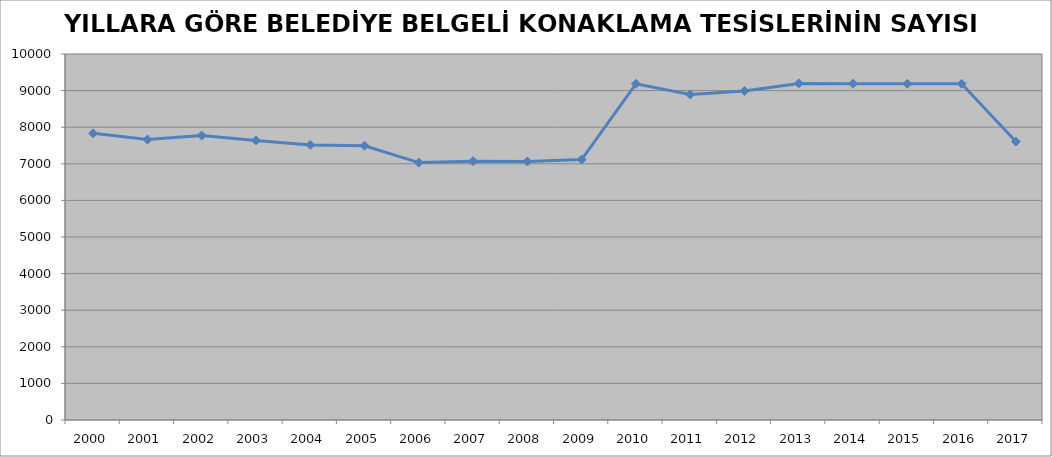
| Category | Series 0 |
|---|---|
| 2000 | 7832 |
| 2001 | 7661 |
| 2002 | 7772 |
| 2003 | 7637 |
| 2004 | 7514 |
| 2005 | 7494 |
| 2006 | 7033 |
| 2007 | 7073 |
| 2008 | 7064 |
| 2009 | 7115 |
| 2010 | 9185 |
| 2011 | 8893 |
| 2012 | 8988 |
| 2013 | 9196 |
| 2014 | 9188 |
| 2015 | 9187 |
| 2016 | 9186 |
| 2017 | 7607 |